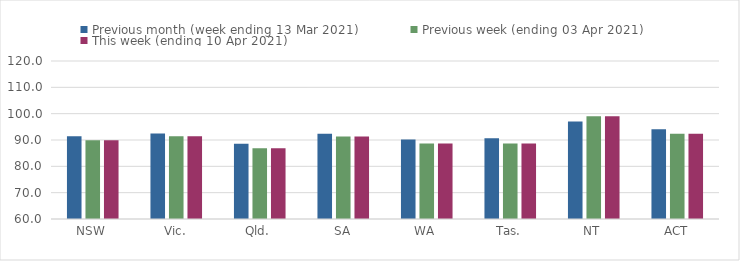
| Category | Previous month (week ending 13 Mar 2021) | Previous week (ending 03 Apr 2021) | This week (ending 10 Apr 2021) |
|---|---|---|---|
| NSW | 91.47 | 89.92 | 89.92 |
| Vic. | 92.45 | 91.41 | 91.41 |
| Qld. | 88.61 | 86.91 | 86.91 |
| SA | 92.4 | 91.37 | 91.37 |
| WA | 90.15 | 88.7 | 88.7 |
| Tas. | 90.65 | 88.69 | 88.69 |
| NT | 97.01 | 99 | 99 |
| ACT | 94.04 | 92.42 | 92.42 |